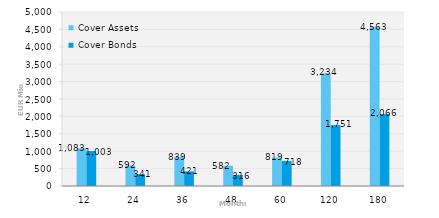
| Category | Cover Assets | Cover Bonds |
|---|---|---|
| 12.0 | 1083.285 | 1003.161 |
| 24.0 | 592.089 | 340.816 |
| 36.0 | 839.03 | 420.5 |
| 48.0 | 582.311 | 316.03 |
| 60.0 | 819.15 | 717.5 |
| 120.0 | 3233.63 | 1751.192 |
| 180.0 | 4562.949 | 2066.283 |